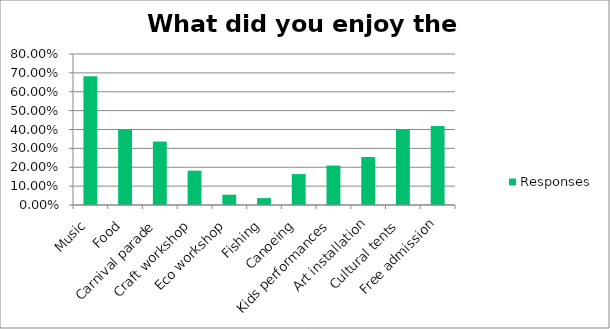
| Category | Responses |
|---|---|
| Music | 0.682 |
| Food | 0.4 |
| Carnival parade | 0.336 |
| Craft workshop | 0.182 |
| Eco workshop | 0.054 |
| Fishing | 0.036 |
| Canoeing | 0.164 |
| Kids performances | 0.209 |
| Art installation | 0.254 |
| Cultural tents | 0.4 |
| Free admission | 0.418 |